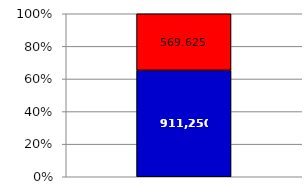
| Category | Series 2 | Series 1 | Series 0 |
|---|---|---|---|
| 0 |  | 911250 | 484625 |